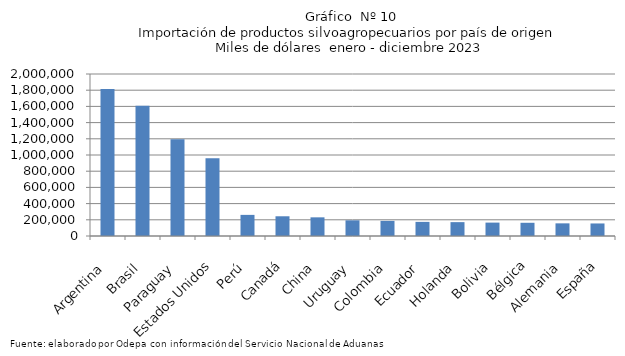
| Category | Series 0 |
|---|---|
| Argentina | 1815726.646 |
| Brasil | 1607267.933 |
| Paraguay | 1195207.502 |
| Estados Unidos | 959649.675 |
| Perú | 260715.61 |
| Canadá | 243496.28 |
| China | 230373.728 |
| Uruguay | 193364.884 |
| Colombia | 186540.111 |
| Ecuador | 174343.277 |
| Holanda | 171104.605 |
| Bolivia | 165363.891 |
| Bélgica | 163151.994 |
| Alemania | 156166.463 |
| España | 154798.724 |